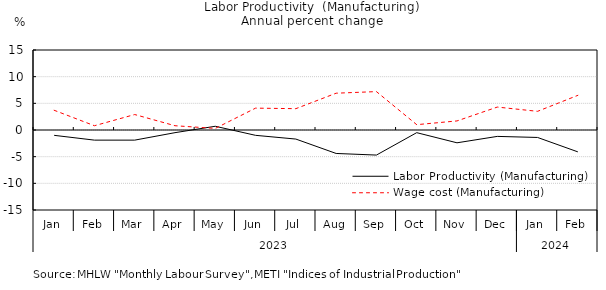
| Category | Labor Productivity (Manufacturing) | Wage cost (Manufacturing) |
|---|---|---|
| 0 | -1 | 3.7 |
| 1 | -1.9 | 0.8 |
| 2 | -1.9 | 2.9 |
| 3 | -0.5 | 0.8 |
| 4 | 0.7 | 0.3 |
| 5 | -1 | 4.1 |
| 6 | -1.7 | 4 |
| 7 | -4.4 | 6.9 |
| 8 | -4.7 | 7.2 |
| 9 | -0.5 | 1 |
| 10 | -2.4 | 1.7 |
| 11 | -1.2 | 4.3 |
| 12 | -1.4 | 3.5 |
| 13 | -4.1 | 6.5 |